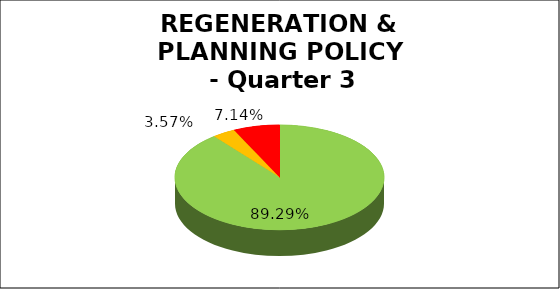
| Category | Q3 |
|---|---|
| Green | 0.893 |
| Amber | 0.036 |
| Red | 0.071 |